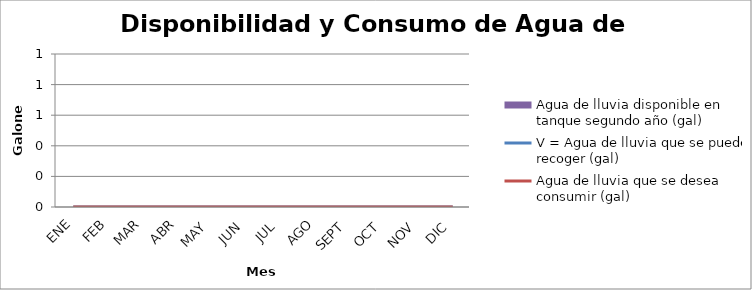
| Category | Agua de lluvia disponible en tanque segundo año (gal) |
|---|---|
| ENE | 0 |
| FEB | 0 |
| MAR | 0 |
| ABR | 0 |
| MAY | 0 |
| JUN | 0 |
| JUL | 0 |
| AGO | 0 |
| SEPT | 0 |
| OCT | 0 |
| NOV | 0 |
| DIC | 0 |